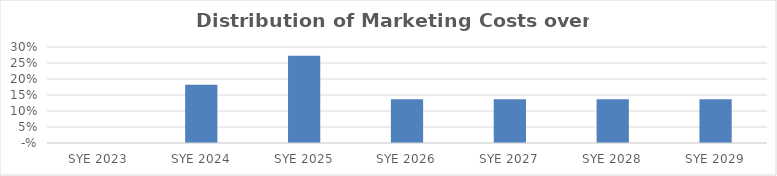
| Category | Series 0 |
|---|---|
| 2023.0 | 0 |
| 2024.0 | 0.182 |
| 2025.0 | 0.273 |
| 2026.0 | 0.136 |
| 2027.0 | 0.136 |
| 2028.0 | 0.136 |
| 2029.0 | 0.136 |